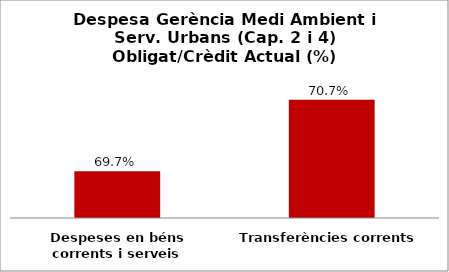
| Category | Series 0 |
|---|---|
| Despeses en béns corrents i serveis | 0.697 |
| Transferències corrents | 0.707 |